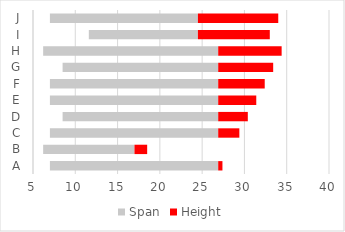
| Category | Low | Span | Height |
|---|---|---|---|
| A | 7 | 19.9 | 0.5 |
| B | 6.2 | 10.8 | 1.5 |
| C | 7 | 19.9 | 2.5 |
| D | 8.5 | 18.4 | 3.5 |
| E | 7 | 19.9 | 4.5 |
| F | 7 | 19.9 | 5.5 |
| G | 8.5 | 18.4 | 6.5 |
| H | 6.2 | 20.7 | 7.5 |
| I | 11.6 | 12.9 | 8.5 |
| J | 7 | 17.5 | 9.5 |